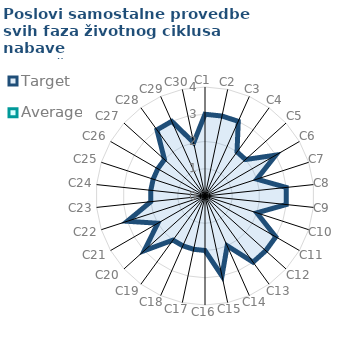
| Category | Target | Average |
|---|---|---|
| C1 | 3 | 0 |
| C2 | 3 | 0 |
| C3 | 3 | 0 |
| C4 | 2 | 0 |
| C5 | 2 | 0 |
| C6 | 3 | 0 |
| C7 | 2 | 0 |
| C8 | 3 | 0 |
| C9 | 3 | 0 |
| C10 | 2 | 0 |
| C11 | 3 | 0 |
| C12 | 3 | 0 |
| C13 | 3 | 0 |
| C14 | 2 | 0 |
| C15 | 3 | 0 |
| C16 | 2 | 0 |
| C17 | 2 | 0 |
| C18 | 2 | 0 |
| C19 | 2 | 0 |
| C20 | 3 | 0 |
| C21 | 2 | 0 |
| C22 | 3 | 0 |
| C23 | 2 | 0 |
| C24 | 2 | 0 |
| C25 | 2 | 0 |
| C26 | 2 | 0 |
| C27 | 2 | 0 |
| C28 | 3 | 0 |
| C29 | 3 | 0 |
| C30 | 2 | 0 |